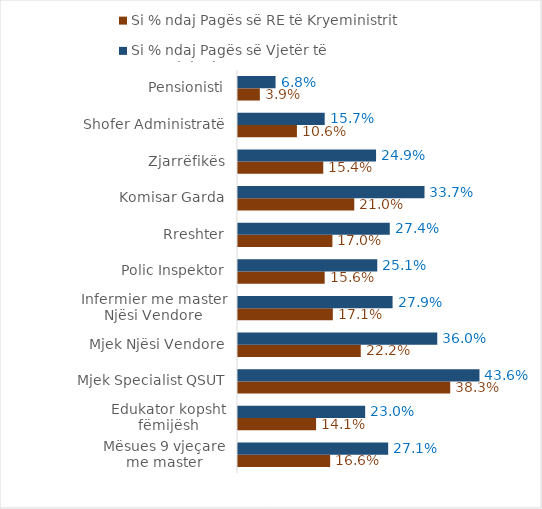
| Category | Si % ndaj Pagës së RE të Kryeministrit | Si % ndaj Pagës së Vjetër të Kryeministrit |
|---|---|---|
| Mësues 9 vjeçare me master | 0.166 | 0.271 |
| Edukator kopsht fëmijësh | 0.141 | 0.23 |
| Mjek Specialist QSUT | 0.383 | 0.436 |
| Mjek Njësi Vendore | 0.222 | 0.36 |
| Infermier me master Njësi Vendore | 0.171 | 0.279 |
| Polic Inspektor | 0.156 | 0.251 |
| Rreshter | 0.17 | 0.274 |
| Komisar Garda | 0.21 | 0.337 |
| Zjarrëfikës | 0.154 | 0.249 |
| Shofer Administratë | 0.106 | 0.157 |
| Pensionisti | 0.039 | 0.068 |